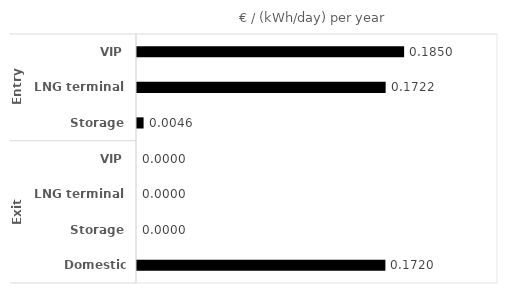
| Category | €/(kWh/day) per year |
|---|---|
| 0 | 0.185 |
| 1 | 0.172 |
| 2 | 0.005 |
| 3 | 0 |
| 4 | 0 |
| 5 | 0 |
| 6 | 0.172 |